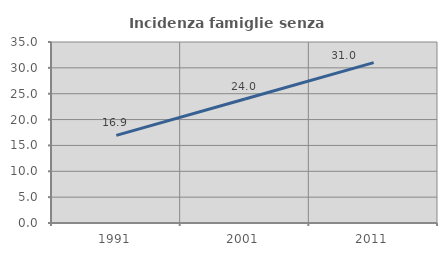
| Category | Incidenza famiglie senza nuclei |
|---|---|
| 1991.0 | 16.944 |
| 2001.0 | 23.977 |
| 2011.0 | 31.014 |